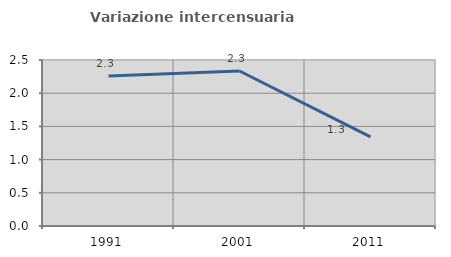
| Category | Variazione intercensuaria annua |
|---|---|
| 1991.0 | 2.259 |
| 2001.0 | 2.335 |
| 2011.0 | 1.343 |